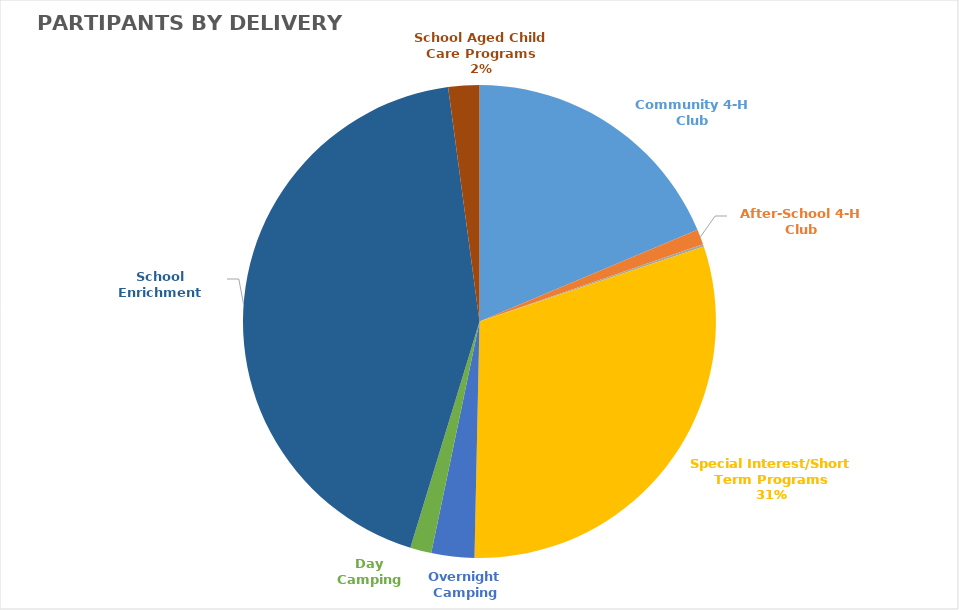
| Category | Participants |
|---|---|
| Community 4-H Club | 17429 |
| After-School 4-H Club | 981 |
| Military 4-H Club | 154 |
| Special Interest/Short Term Programs | 28464 |
| Overnight Camping | 2743 |
| Day Camping | 1354 |
| School Enrichment | 40318 |
| School Aged Child Care Programs | 1982 |